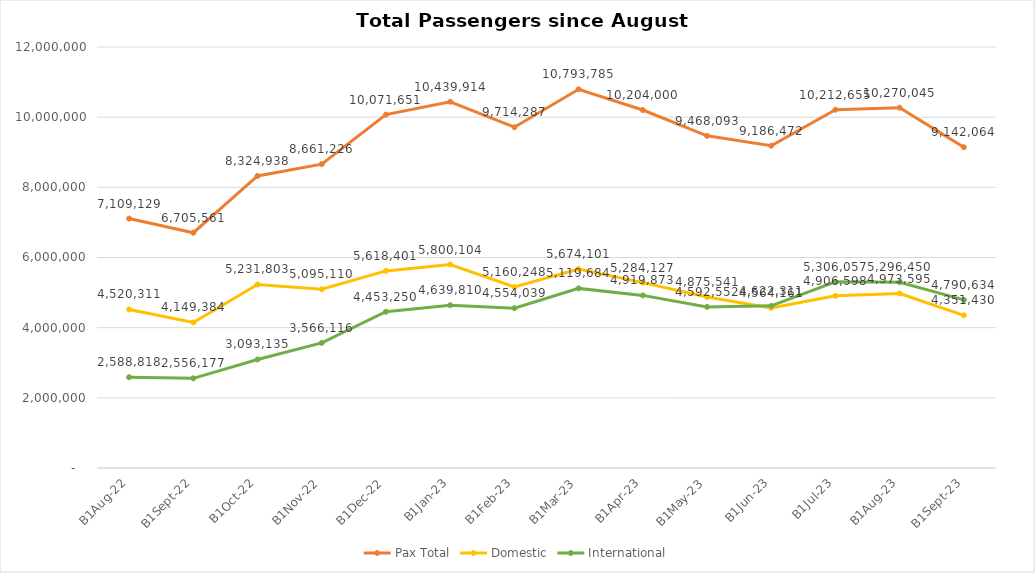
| Category | Pax Total | Domestic | International |
|---|---|---|---|
| 2022-08-01 | 7109129 | 4520311 | 2588818 |
| 2022-09-01 | 6705561 | 4149384 | 2556177 |
| 2022-10-01 | 8324938 | 5231803 | 3093135 |
| 2022-11-01 | 8661226 | 5095110 | 3566116 |
| 2022-12-01 | 10071651 | 5618401 | 4453250 |
| 2023-01-01 | 10439914 | 5800104 | 4639810 |
| 2023-02-01 | 9714287 | 5160248 | 4554039 |
| 2023-03-01 | 10793785 | 5674101 | 5119684 |
| 2023-04-01 | 10204000 | 5284127 | 4919873 |
| 2023-05-01 | 9468093 | 4875541 | 4592552 |
| 2023-06-01 | 9186472 | 4564161 | 4622311 |
| 2023-07-01 | 10212655 | 4906598 | 5306057 |
| 2023-08-01 | 10270045 | 4973595 | 5296450 |
| 2023-09-01 | 9142064 | 4351430 | 4790634 |